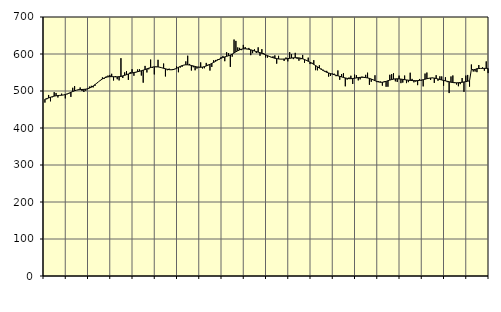
| Category | Piggar | Series 1 |
|---|---|---|
| nan | 468.7 | 477.84 |
| 1.0 | 477.7 | 479.44 |
| 1.0 | 489.3 | 481.17 |
| 1.0 | 472.1 | 483.04 |
| 1.0 | 483.1 | 484.7 |
| 1.0 | 496.9 | 486.16 |
| 1.0 | 494.7 | 487.12 |
| 1.0 | 482.5 | 487.73 |
| 1.0 | 487.7 | 488.14 |
| 1.0 | 492.8 | 488.56 |
| 1.0 | 489.1 | 489.3 |
| 1.0 | 480 | 490.5 |
| nan | 491.2 | 492.19 |
| 2.0 | 493.1 | 494.25 |
| 2.0 | 484.1 | 496.46 |
| 2.0 | 508.7 | 498.62 |
| 2.0 | 513.1 | 500.59 |
| 2.0 | 502 | 502.14 |
| 2.0 | 504.4 | 503.17 |
| 2.0 | 509.5 | 503.79 |
| 2.0 | 500.2 | 504.15 |
| 2.0 | 497.3 | 504.47 |
| 2.0 | 500.6 | 505.02 |
| 2.0 | 504.8 | 506.08 |
| nan | 511.9 | 507.84 |
| 3.0 | 514 | 510.3 |
| 3.0 | 509.7 | 513.5 |
| 3.0 | 513.7 | 517.25 |
| 3.0 | 520.9 | 521.26 |
| 3.0 | 525.4 | 525.34 |
| 3.0 | 528.4 | 529.2 |
| 3.0 | 536.8 | 532.56 |
| 3.0 | 533.1 | 535.23 |
| 3.0 | 539.3 | 537.1 |
| 3.0 | 541.7 | 538.27 |
| 3.0 | 543.4 | 538.8 |
| nan | 546.5 | 538.8 |
| 4.0 | 528.4 | 538.53 |
| 4.0 | 540.5 | 538.3 |
| 4.0 | 531.8 | 538.31 |
| 4.0 | 528.6 | 538.68 |
| 4.0 | 588.7 | 539.52 |
| 4.0 | 535.2 | 540.82 |
| 4.0 | 550.3 | 542.43 |
| 4.0 | 553.7 | 544.2 |
| 4.0 | 530.1 | 546 |
| 4.0 | 551.2 | 547.54 |
| 4.0 | 559 | 548.78 |
| nan | 541.2 | 549.88 |
| 5.0 | 549.7 | 550.99 |
| 5.0 | 558.3 | 552.14 |
| 5.0 | 558.8 | 553.37 |
| 5.0 | 541.8 | 554.78 |
| 5.0 | 522.5 | 556.31 |
| 5.0 | 567.8 | 558 |
| 5.0 | 550.1 | 559.85 |
| 5.0 | 558.6 | 561.66 |
| 5.0 | 584.9 | 563.31 |
| 5.0 | 562.4 | 564.63 |
| 5.0 | 544.8 | 565.39 |
| nan | 564.5 | 565.49 |
| 6.0 | 584.3 | 565.05 |
| 6.0 | 563.8 | 564.12 |
| 6.0 | 562.6 | 562.83 |
| 6.0 | 574.2 | 561.4 |
| 6.0 | 539.3 | 560 |
| 6.0 | 556.1 | 558.67 |
| 6.0 | 560.4 | 557.63 |
| 6.0 | 556.9 | 557.27 |
| 6.0 | 559.5 | 557.72 |
| 6.0 | 559.8 | 559.06 |
| 6.0 | 566.5 | 561.27 |
| nan | 550.7 | 563.97 |
| 7.0 | 563.3 | 566.56 |
| 7.0 | 565.3 | 568.67 |
| 7.0 | 570 | 570.15 |
| 7.0 | 580.1 | 570.85 |
| 7.0 | 595.4 | 570.78 |
| 7.0 | 573.1 | 570.14 |
| 7.0 | 555.4 | 569.06 |
| 7.0 | 564.2 | 567.7 |
| 7.0 | 556 | 566.27 |
| 7.0 | 560.6 | 565.02 |
| 7.0 | 565.4 | 564.21 |
| nan | 577.3 | 564.04 |
| 8.0 | 560.9 | 564.62 |
| 8.0 | 561.5 | 565.91 |
| 8.0 | 575.9 | 567.72 |
| 8.0 | 571.2 | 569.8 |
| 8.0 | 555.2 | 572.07 |
| 8.0 | 565 | 574.54 |
| 8.0 | 583.1 | 577.28 |
| 8.0 | 583.9 | 580.27 |
| 8.0 | 585.3 | 583.26 |
| 8.0 | 584.4 | 586.04 |
| 8.0 | 591.7 | 588.46 |
| nan | 595 | 590.46 |
| 9.0 | 580.5 | 592.1 |
| 9.0 | 604.8 | 593.67 |
| 9.0 | 602.4 | 595.33 |
| 9.0 | 565.2 | 597.32 |
| 9.0 | 592.7 | 599.81 |
| 9.0 | 639.1 | 602.73 |
| 9.0 | 635.4 | 605.82 |
| 9.0 | 617.8 | 608.69 |
| 9.0 | 616.6 | 611.13 |
| 9.0 | 610.5 | 612.92 |
| 9.0 | 624.6 | 613.91 |
| nan | 618.7 | 614.14 |
| 10.0 | 612.9 | 613.7 |
| 10.0 | 616.4 | 612.75 |
| 10.0 | 596.9 | 611.38 |
| 10.0 | 602.3 | 609.8 |
| 10.0 | 612.7 | 608.16 |
| 10.0 | 602.7 | 606.59 |
| 10.0 | 618 | 605.05 |
| 10.0 | 595.2 | 603.47 |
| 10.0 | 613.2 | 601.73 |
| 10.0 | 602.7 | 599.85 |
| 10.0 | 590.5 | 597.82 |
| nan | 590.2 | 595.68 |
| 11.0 | 592.4 | 593.59 |
| 11.0 | 591 | 591.64 |
| 11.0 | 593.7 | 589.94 |
| 11.0 | 596.3 | 588.54 |
| 11.0 | 573.9 | 587.43 |
| 11.0 | 595.1 | 586.66 |
| 11.0 | 586 | 586.26 |
| 11.0 | 586.5 | 586.15 |
| 11.0 | 581.1 | 586.36 |
| 11.0 | 590.6 | 586.82 |
| 11.0 | 580.1 | 587.48 |
| nan | 604.9 | 588.29 |
| 12.0 | 599.5 | 589.08 |
| 12.0 | 586.2 | 589.64 |
| 12.0 | 603.1 | 589.91 |
| 12.0 | 587 | 589.86 |
| 12.0 | 581.8 | 589.42 |
| 12.0 | 585.7 | 588.52 |
| 12.0 | 597.5 | 587.09 |
| 12.0 | 576.3 | 585.21 |
| 12.0 | 581.4 | 582.93 |
| 12.0 | 590.2 | 580.4 |
| 12.0 | 572.8 | 577.72 |
| nan | 576.4 | 574.91 |
| 13.0 | 583.4 | 571.91 |
| 13.0 | 556.2 | 568.69 |
| 13.0 | 555.9 | 565.3 |
| 13.0 | 569.5 | 561.88 |
| 13.0 | 560.6 | 558.61 |
| 13.0 | 557.7 | 555.53 |
| 13.0 | 554.5 | 552.83 |
| 13.0 | 554.4 | 550.56 |
| 13.0 | 538.9 | 548.71 |
| 13.0 | 540.5 | 547.08 |
| 13.0 | 547.1 | 545.59 |
| nan | 546.8 | 544.16 |
| 14.0 | 540 | 542.64 |
| 14.0 | 555.6 | 541.07 |
| 14.0 | 530.3 | 539.57 |
| 14.0 | 545.9 | 538.1 |
| 14.0 | 548.1 | 536.65 |
| 14.0 | 512.7 | 535.3 |
| 14.0 | 530.8 | 534.13 |
| 14.0 | 536.6 | 533.38 |
| 14.0 | 541.3 | 533.24 |
| 14.0 | 519.1 | 533.71 |
| 14.0 | 544.4 | 534.52 |
| nan | 542.6 | 535.44 |
| 15.0 | 528.7 | 536.27 |
| 15.0 | 531.4 | 536.83 |
| 15.0 | 539 | 537.02 |
| 15.0 | 538.1 | 536.81 |
| 15.0 | 543.7 | 536.19 |
| 15.0 | 549.5 | 535.3 |
| 15.0 | 516.8 | 534.09 |
| 15.0 | 524.9 | 532.39 |
| 15.0 | 529.6 | 530.23 |
| 15.0 | 542.5 | 527.93 |
| 15.0 | 524 | 525.91 |
| nan | 526.8 | 524.34 |
| 16.0 | 525.5 | 523.54 |
| 16.0 | 514.4 | 523.68 |
| 16.0 | 526.6 | 524.57 |
| 16.0 | 511.4 | 526 |
| 16.0 | 511.5 | 527.75 |
| 16.0 | 543.8 | 529.46 |
| 16.0 | 545.7 | 530.92 |
| 16.0 | 548 | 532.09 |
| 16.0 | 526.1 | 532.8 |
| 16.0 | 524.4 | 533.02 |
| 16.0 | 541.6 | 532.76 |
| nan | 521.2 | 532.16 |
| 17.0 | 522.7 | 531.44 |
| 17.0 | 541.8 | 530.66 |
| 17.0 | 521.3 | 529.87 |
| 17.0 | 523.9 | 529.14 |
| 17.0 | 549.4 | 528.62 |
| 17.0 | 532.7 | 528.24 |
| 17.0 | 523.4 | 527.98 |
| 17.0 | 525.2 | 527.89 |
| 17.0 | 515.8 | 528.1 |
| 17.0 | 532.5 | 528.67 |
| 17.0 | 528 | 529.5 |
| nan | 512.5 | 530.6 |
| 18.0 | 547.1 | 531.89 |
| 18.0 | 549.9 | 533.17 |
| 18.0 | 533.1 | 534.37 |
| 18.0 | 530 | 535.25 |
| 18.0 | 536 | 535.45 |
| 18.0 | 521.9 | 534.88 |
| 18.0 | 542.8 | 533.79 |
| 18.0 | 527.7 | 532.47 |
| 18.0 | 539.7 | 531.1 |
| 18.0 | 539.4 | 529.75 |
| 18.0 | 514.2 | 528.54 |
| nan | 537.2 | 527.42 |
| 19.0 | 523.9 | 526.24 |
| 19.0 | 494.4 | 524.98 |
| 19.0 | 539.3 | 523.76 |
| 19.0 | 542 | 522.81 |
| 19.0 | 524 | 522.26 |
| 19.0 | 517.6 | 522.17 |
| 19.0 | 512.9 | 522.46 |
| 19.0 | 518.5 | 522.98 |
| 19.0 | 535.1 | 523.67 |
| 19.0 | 497.8 | 524.49 |
| 19.0 | 541.7 | 525.37 |
| nan | 543.4 | 526.4 |
| 20.0 | 511.9 | 527.53 |
| 20.0 | 571.6 | 558.76 |
| 20.0 | 552.7 | 557.35 |
| 20.0 | 552.7 | 558.16 |
| 20.0 | 550.9 | 560.27 |
| 20.0 | 570.2 | 560.66 |
| 20.0 | 560.8 | 560.95 |
| 20.0 | 563.9 | 561.16 |
| 20.0 | 554.7 | 561.23 |
| 20.0 | 580 | 561.17 |
| 20.0 | 548.4 | 561.01 |